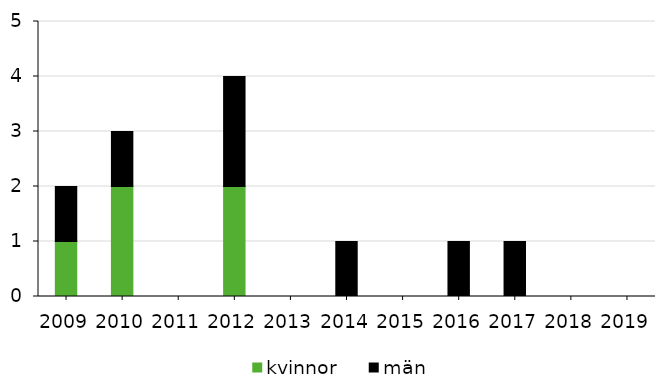
| Category | kvinnor | män |
|---|---|---|
| 2009 | 1 | 1 |
| 2010 | 2 | 1 |
| 2011 | 0 | 0 |
| 2012 | 2 | 2 |
| 2013 | 0 | 0 |
| 2014 | 0 | 1 |
| 2015 | 0 | 0 |
| 2016 | 0 | 1 |
| 2017 | 0 | 1 |
| 2018 | 0 | 0 |
| 2019 | 0 | 0 |